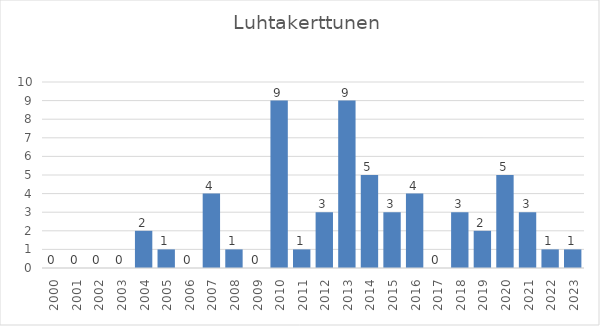
| Category | Series 0 |
|---|---|
| 2000.0 | 0 |
| 2001.0 | 0 |
| 2002.0 | 0 |
| 2003.0 | 0 |
| 2004.0 | 2 |
| 2005.0 | 1 |
| 2006.0 | 0 |
| 2007.0 | 4 |
| 2008.0 | 1 |
| 2009.0 | 0 |
| 2010.0 | 9 |
| 2011.0 | 1 |
| 2012.0 | 3 |
| 2013.0 | 9 |
| 2014.0 | 5 |
| 2015.0 | 3 |
| 2016.0 | 4 |
| 2017.0 | 0 |
| 2018.0 | 3 |
| 2019.0 | 2 |
| 2020.0 | 5 |
| 2021.0 | 3 |
| 2022.0 | 1 |
| 2023.0 | 1 |